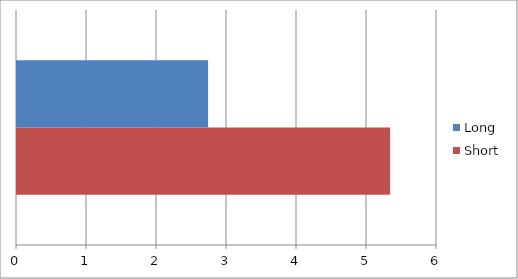
| Category | Short | Long |
|---|---|---|
| 0 | 5.33 | 2.73 |